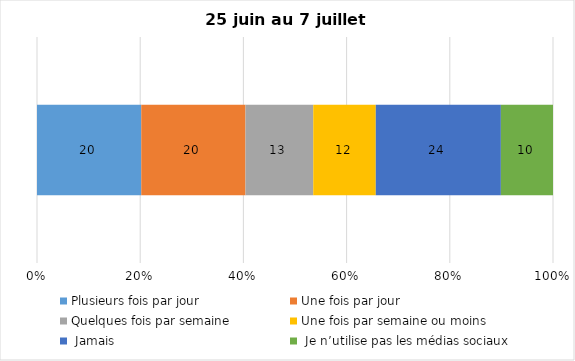
| Category | Plusieurs fois par jour | Une fois par jour | Quelques fois par semaine   | Une fois par semaine ou moins   |  Jamais   |  Je n’utilise pas les médias sociaux |
|---|---|---|---|---|---|---|
| 0 | 20 | 20 | 13 | 12 | 24 | 10 |